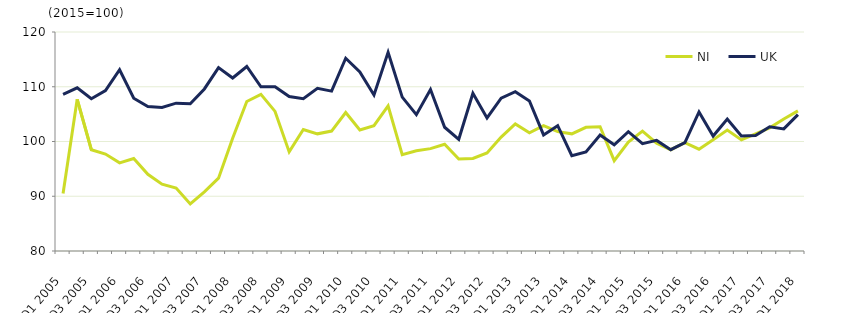
| Category | NI | UK |
|---|---|---|
| Q1 2005 | 90.5 | 108.6 |
|  | 107.7 | 109.8 |
| Q3 2005 | 98.5 | 107.8 |
|  | 97.7 | 109.3 |
| Q1 2006 | 96.1 | 113.1 |
|  | 96.9 | 107.9 |
| Q3 2006 | 94 | 106.4 |
|  | 92.2 | 106.2 |
| Q1 2007 | 91.5 | 107 |
|  | 88.6 | 106.9 |
| Q3 2007 | 90.8 | 109.6 |
|  | 93.3 | 113.5 |
| Q1 2008 | 100.6 | 111.6 |
|  | 107.3 | 113.7 |
| Q3 2008 | 108.6 | 110 |
|  | 105.5 | 110 |
| Q1 2009 | 98.1 | 108.2 |
|  | 102.2 | 107.8 |
| Q3 2009 | 101.4 | 109.7 |
|  | 101.9 | 109.2 |
| Q1 2010 | 105.3 | 115.2 |
|  | 102.1 | 112.7 |
| Q3 2010 | 102.9 | 108.5 |
|  | 106.5 | 116.3 |
| Q1 2011 | 97.6 | 108.1 |
|  | 98.3 | 104.9 |
| Q3 2011 | 98.7 | 109.5 |
|  | 99.5 | 102.6 |
| Q1 2012 | 96.8 | 100.4 |
|  | 96.9 | 108.8 |
| Q3 2012 | 97.9 | 104.3 |
|  | 100.8 | 107.9 |
| Q1 2013 | 103.2 | 109.1 |
|  | 101.6 | 107.4 |
| Q3 2013 | 102.9 | 101.2 |
|  | 101.8 | 102.9 |
| Q1 2014 | 101.4 | 97.4 |
|  | 102.6 | 98.1 |
| Q3 2014 | 102.7 | 101.2 |
|  | 96.5 | 99.4 |
| Q1 2015 | 99.9 | 101.8 |
|  | 101.9 | 99.6 |
| Q3 2015 | 99.7 | 100.2 |
|  | 98.5 | 98.5 |
| Q1 2016 | 99.8 | 99.8 |
|  | 98.6 | 105.4 |
| Q3 2016 | 100.3 | 101 |
|  | 102.1 | 104.1 |
| Q1 2017 | 100.3 | 101 |
|  | 101.4 | 101.1 |
| Q3 2017 | 102.5 | 102.7 |
|  | 104.1 | 102.3 |
| Q1 2018 | 105.6 | 104.9 |